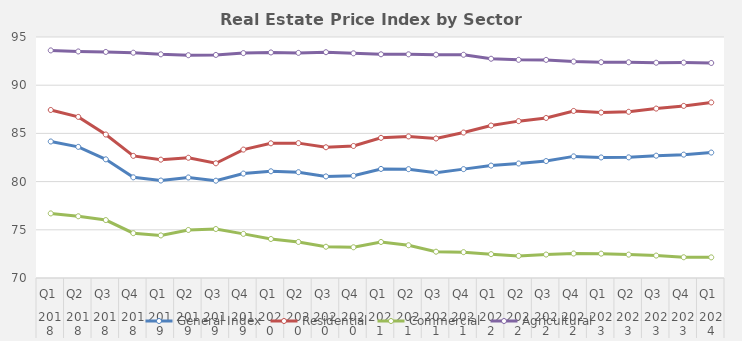
| Category | General Index | Residential | Commercial | Agricultural |
|---|---|---|---|---|
| 0 | 84.16 | 87.43 | 76.7 | 93.61 |
| 1 | 83.603 | 86.713 | 76.403 | 93.5 |
| 2 | 82.31 | 84.883 | 76.01 | 93.45 |
| 3 | 80.443 | 82.67 | 74.65 | 93.37 |
| 4 | 80.11 | 82.277 | 74.417 | 93.203 |
| 5 | 80.427 | 82.473 | 74.983 | 93.11 |
| 6 | 80.093 | 81.9 | 75.083 | 93.14 |
| 7 | 80.833 | 83.32 | 74.577 | 93.33 |
| 8 | 81.07 | 83.973 | 74.047 | 93.397 |
| 9 | 80.977 | 83.99 | 73.74 | 93.353 |
| 10 | 80.538 | 83.562 | 73.242 | 93.424 |
| 11 | 80.6 | 83.696 | 73.187 | 93.307 |
| 12 | 81.315 | 84.54 | 73.736 | 93.206 |
| 13 | 81.291 | 84.687 | 73.398 | 93.204 |
| 14 | 80.925 | 84.473 | 72.728 | 93.164 |
| 15 | 81.295 | 85.089 | 72.682 | 93.157 |
| 16 | 81.662 | 85.816 | 72.474 | 92.745 |
| 17 | 81.879 | 86.272 | 72.295 | 92.633 |
| 18 | 82.132 | 86.603 | 72.433 | 92.625 |
| 19 | 82.616 | 87.33 | 72.541 | 92.453 |
| 20 | 82.506 | 87.165 | 72.527 | 92.384 |
| 21 | 82.516 | 87.24 | 72.425 | 92.376 |
| 22 | 82.687 | 87.574 | 72.328 | 92.332 |
| 23 | 82.797 | 87.853 | 72.152 | 92.343 |
| 24 | 83.013 | 88.213 | 72.141 | 92.306 |